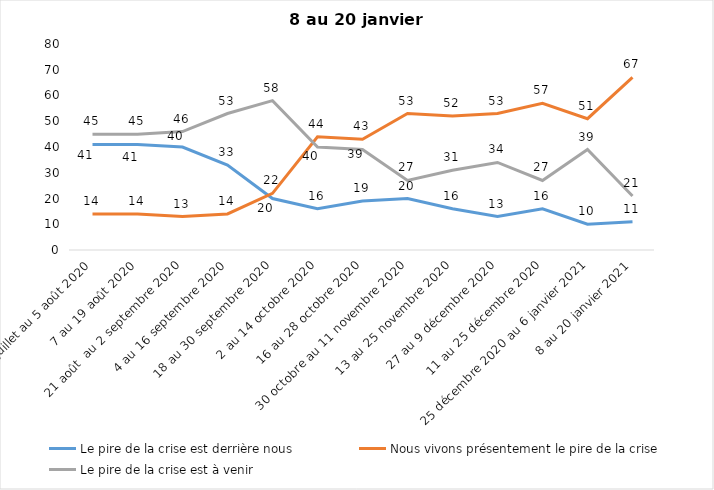
| Category | Le pire de la crise est derrière nous | Nous vivons présentement le pire de la crise | Le pire de la crise est à venir |
|---|---|---|---|
| 24 juillet au 5 août 2020 | 41 | 14 | 45 |
| 7 au 19 août 2020 | 41 | 14 | 45 |
| 21 août  au 2 septembre 2020 | 40 | 13 | 46 |
| 4 au 16 septembre 2020 | 33 | 14 | 53 |
| 18 au 30 septembre 2020 | 20 | 22 | 58 |
| 2 au 14 octobre 2020 | 16 | 44 | 40 |
| 16 au 28 octobre 2020 | 19 | 43 | 39 |
| 30 octobre au 11 novembre 2020 | 20 | 53 | 27 |
| 13 au 25 novembre 2020 | 16 | 52 | 31 |
| 27 au 9 décembre 2020 | 13 | 53 | 34 |
| 11 au 25 décembre 2020 | 16 | 57 | 27 |
| 25 décembre 2020 au 6 janvier 2021 | 10 | 51 | 39 |
| 8 au 20 janvier 2021 | 11 | 67 | 21 |